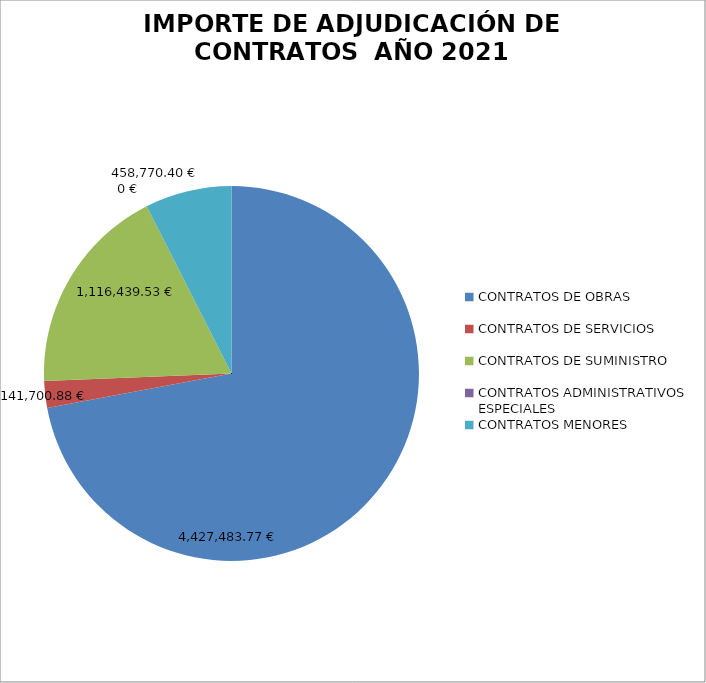
| Category | PORCENTAJE DE ADJUDICACIÓN DE CONTRATOS  |
|---|---|
| CONTRATOS DE OBRAS | 72.057 |
| CONTRATOS DE SERVICIOS | 2.306 |
| CONTRATOS DE SUMINISTRO | 18.17 |
| CONTRATOS ADMINISTRATIVOS ESPECIALES | 0 |
| CONTRATOS MENORES | 7.466 |